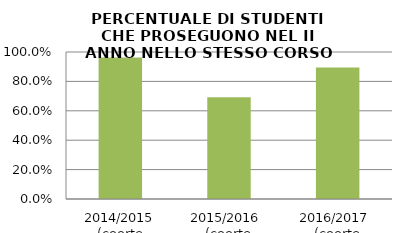
| Category | 2014/2015 (coorte 2013/14) 2015/2016  (coorte 2014/15) 2016/2017  (coorte 2015/16) |
|---|---|
| 2014/2015 (coorte 2013/14) | 0.963 |
| 2015/2016  (coorte 2014/15) | 0.692 |
| 2016/2017  (coorte 2015/16) | 0.895 |